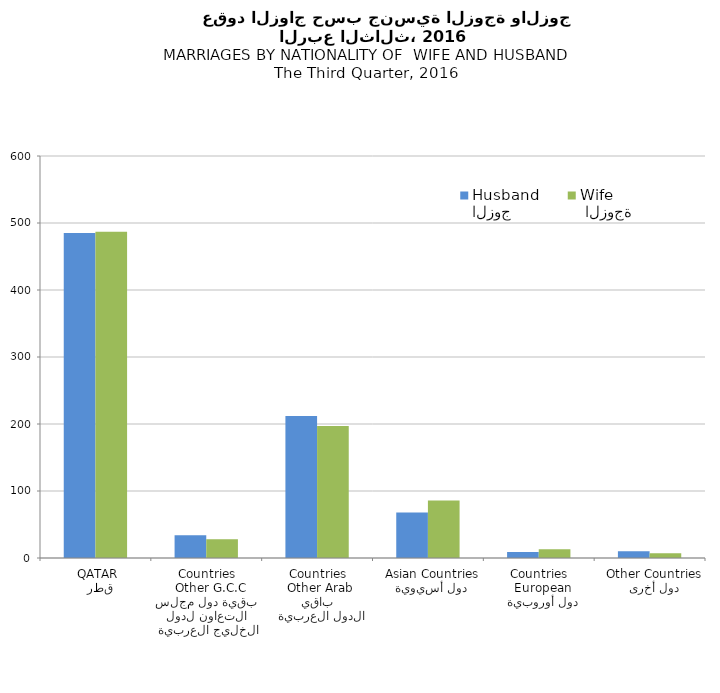
| Category | الزوج
Husband |  الزوجة
Wife |
|---|---|---|
|   قطر
 QATAR | 485 | 487 |
|  بقية دول مجلس التعاون لدول الخليج العربية
  Other G.C.C Countries | 34 | 28 |
|   باقي الدول العربية
 Other Arab Countries | 212 | 197 |
|   دول أسيوية
  Asian Countries | 68 | 86 |
|   دول أوروبية
  European Countries | 9 | 13 |
|   دول أخرى
  Other Countries | 10 | 7 |